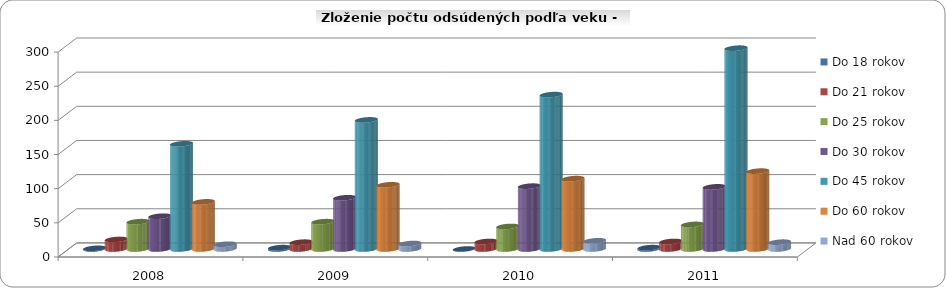
| Category | Do 18 rokov | Do 21 rokov | Do 25 rokov | Do 30 rokov | Do 45 rokov | Do 60 rokov | Nad 60 rokov |
|---|---|---|---|---|---|---|---|
| 2008.0 | 1 | 14 | 40 | 48 | 154 | 69 | 7 |
| 2009.0 | 2 | 10 | 40 | 75 | 189 | 94 | 8 |
| 2010.0 | 0 | 11 | 33 | 92 | 226 | 103 | 12 |
| 2011.0 | 2 | 11 | 36 | 91 | 294 | 114 | 10 |